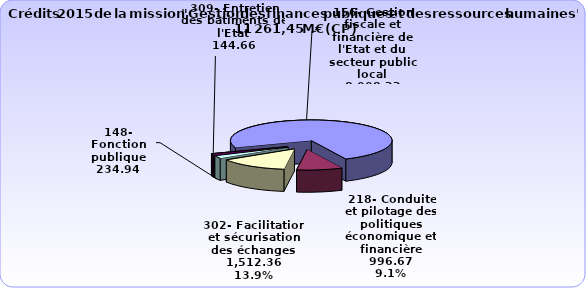
| Category | Series 0 |
|---|---|
| 156- Gestion fiscale et financière de l'Etat et du secteur public local | 8008216153 |
| 218- Conduite et pilotage des politiques économique et financière | 996674883 |
| 302- Facilitation et sécurisation des échanges | 1512362451 |
| 148- Fonction publique | 234939187 |
| 309- Entretien des bâtiments de l'Etat | 144655844 |